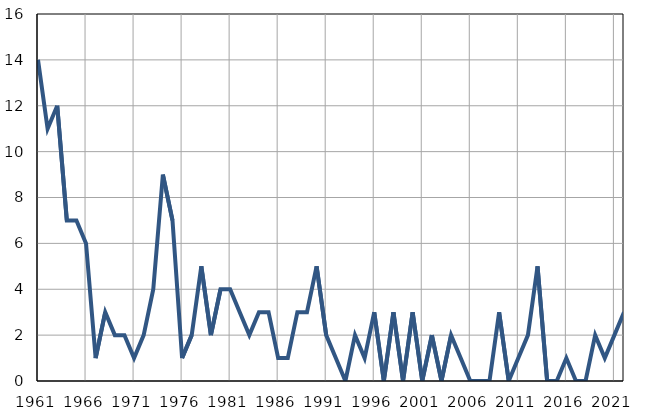
| Category | Infants
deaths |
|---|---|
| 1961.0 | 14 |
| 1962.0 | 11 |
| 1963.0 | 12 |
| 1964.0 | 7 |
| 1965.0 | 7 |
| 1966.0 | 6 |
| 1967.0 | 1 |
| 1968.0 | 3 |
| 1969.0 | 2 |
| 1970.0 | 2 |
| 1971.0 | 1 |
| 1972.0 | 2 |
| 1973.0 | 4 |
| 1974.0 | 9 |
| 1975.0 | 7 |
| 1976.0 | 1 |
| 1977.0 | 2 |
| 1978.0 | 5 |
| 1979.0 | 2 |
| 1980.0 | 4 |
| 1981.0 | 4 |
| 1982.0 | 3 |
| 1983.0 | 2 |
| 1984.0 | 3 |
| 1985.0 | 3 |
| 1986.0 | 1 |
| 1987.0 | 1 |
| 1988.0 | 3 |
| 1989.0 | 3 |
| 1990.0 | 5 |
| 1991.0 | 2 |
| 1992.0 | 1 |
| 1993.0 | 0 |
| 1994.0 | 2 |
| 1995.0 | 1 |
| 1996.0 | 3 |
| 1997.0 | 0 |
| 1998.0 | 3 |
| 1999.0 | 0 |
| 2000.0 | 3 |
| 2001.0 | 0 |
| 2002.0 | 2 |
| 2003.0 | 0 |
| 2004.0 | 2 |
| 2005.0 | 1 |
| 2006.0 | 0 |
| 2007.0 | 0 |
| 2008.0 | 0 |
| 2009.0 | 3 |
| 2010.0 | 0 |
| 2011.0 | 1 |
| 2012.0 | 2 |
| 2013.0 | 5 |
| 2014.0 | 0 |
| 2015.0 | 0 |
| 2016.0 | 1 |
| 2017.0 | 0 |
| 2018.0 | 0 |
| 2019.0 | 2 |
| 2020.0 | 1 |
| 2021.0 | 2 |
| 2022.0 | 3 |